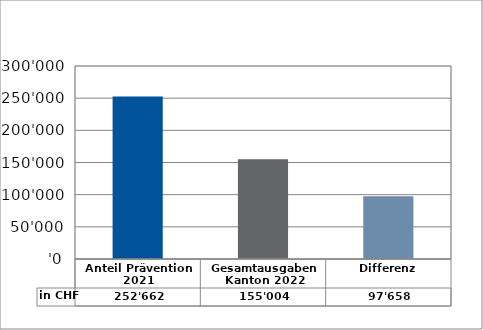
| Category | in CHF |
|---|---|
| Anteil Prävention 2021

 | 252662 |
| Gesamtausgaben Kanton 2022
 | 155004 |
| Differenz | 97658 |